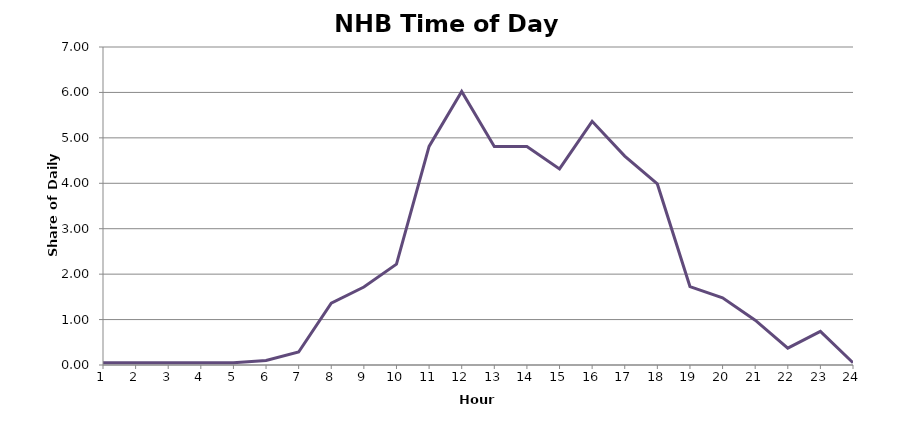
| Category | DEP_NHB |
|---|---|
| 1.0 | 0.049 |
| 2.0 | 0.049 |
| 3.0 | 0.049 |
| 4.0 | 0.049 |
| 5.0 | 0.049 |
| 6.0 | 0.099 |
| 7.0 | 0.286 |
| 8.0 | 1.36 |
| 9.0 | 1.717 |
| 10.0 | 2.22 |
| 11.0 | 4.811 |
| 12.0 | 6.02 |
| 13.0 | 4.811 |
| 14.0 | 4.811 |
| 15.0 | 4.317 |
| 16.0 | 5.365 |
| 17.0 | 4.599 |
| 18.0 | 3.985 |
| 19.0 | 1.727 |
| 20.0 | 1.48 |
| 21.0 | 0.987 |
| 22.0 | 0.37 |
| 23.0 | 0.74 |
| 24.0 | 0.049 |